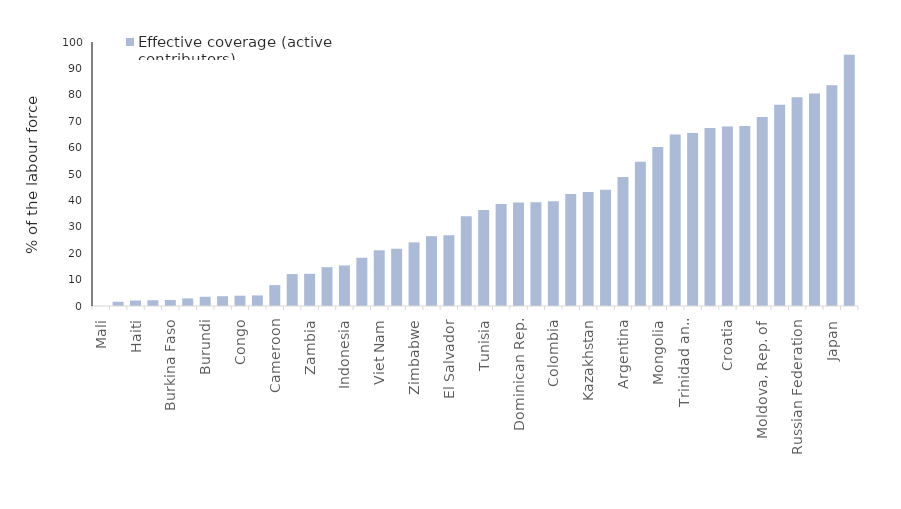
| Category | Effective coverage (active contributors) |
|---|---|
| Mali | 0.051 |
| Tanzania, United Rep. of | 1.6 |
| Haiti | 2.061 |
| Togo | 2.18 |
| Burkina Faso | 2.261 |
| Myanmar | 2.861 |
| Burundi | 3.5 |
| India | 3.702 |
| Congo | 3.9 |
| Benin | 4 |
| Cameroon | 7.902 |
| The Gambia | 12.1 |
| Zambia | 12.198 |
| Oman | 14.7 |
| Indonesia | 15.364 |
| Honduras | 18.27 |
| Viet Nam | 21.103 |
| Paraguay | 21.7 |
| Zimbabwe | 24.1 |
| China | 26.451 |
| El Salvador | 26.8 |
| Albania | 34 |
| Tunisia | 36.4 |
| Turkey | 38.6 |
| Dominican Rep. | 39.208 |
| Jordan  | 39.3 |
| Colombia | 39.636 |
| Brazil | 42.4 |
| Kazakhstan | 43.148 |
| Malaysia  | 43.988 |
| Argentina | 48.851 |
| Uruguay | 54.65 |
| Mongolia | 60.23 |
| Barbados | 65 |
| Trinidad and Tobago | 65.5 |
| Belize | 67.4 |
| Croatia | 68 |
| Cyprus | 68.18 |
| Moldova, Rep. of | 71.6 |
| Spain | 76.23 |
| Russian Federation | 79.1 |
| Slovenia | 80.454 |
| Japan | 83.6 |
| Poland | 95.2 |